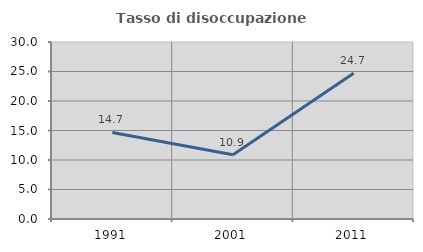
| Category | Tasso di disoccupazione giovanile  |
|---|---|
| 1991.0 | 14.662 |
| 2001.0 | 10.88 |
| 2011.0 | 24.695 |